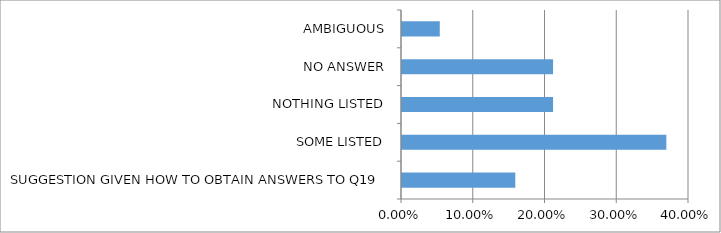
| Category | Series 0 |
|---|---|
| SUGGESTION GIVEN HOW TO OBTAIN ANSWERS TO Q19 | 0.158 |
| SOME LISTED | 0.368 |
| NOTHING LISTED | 0.211 |
| NO ANSWER | 0.211 |
| AMBIGUOUS | 0.053 |